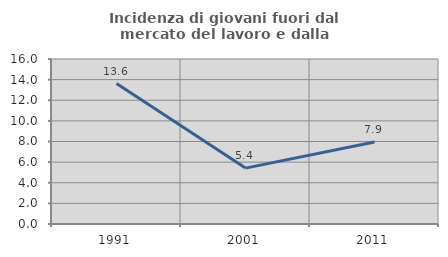
| Category | Incidenza di giovani fuori dal mercato del lavoro e dalla formazione  |
|---|---|
| 1991.0 | 13.617 |
| 2001.0 | 5.419 |
| 2011.0 | 7.947 |